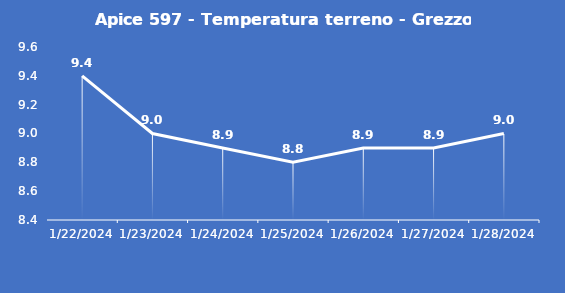
| Category | Apice 597 - Temperatura terreno - Grezzo (°C) |
|---|---|
| 1/22/24 | 9.4 |
| 1/23/24 | 9 |
| 1/24/24 | 8.9 |
| 1/25/24 | 8.8 |
| 1/26/24 | 8.9 |
| 1/27/24 | 8.9 |
| 1/28/24 | 9 |